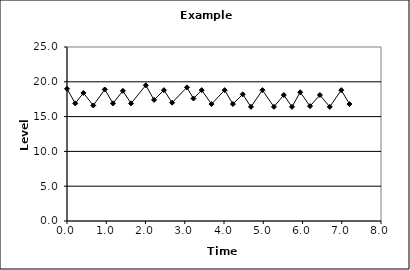
| Category | Series 0 |
|---|---|
| 0.0 | 19 |
| 0.20972222222189885 | 16.9 |
| 0.4187500000043656 | 18.4 |
| 0.6694444444437977 | 16.6 |
| 0.9625000000014552 | 18.9 |
| 1.171527777776646 | 16.9 |
| 1.4229166666700621 | 18.7 |
| 1.6319444444452529 | 16.9 |
| 2.008333333331393 | 19.5 |
| 2.218055555553292 | 17.4 |
| 2.46875 | 18.8 |
| 2.6777777777824667 | 17 |
| 3.054861111115315 | 19.2 |
| 3.2222222222262644 | 17.6 |
| 3.431250000001455 | 18.8 |
| 3.6819444444481633 | 16.8 |
| 4.016666666670062 | 18.8 |
| 4.226388888891961 | 16.8 |
| 4.477083333331393 | 18.2 |
| 4.686805555553292 | 16.4 |
| 4.979166666664241 | 18.8 |
| 5.272222222221899 | 16.4 |
| 5.522916666668607 | 18.1 |
| 5.731944444443798 | 16.4 |
| 5.9416666666656965 | 18.5 |
| 6.192361111112405 | 16.5 |
| 6.443749999998545 | 18.1 |
| 6.694444444445253 | 16.4 |
| 6.98750000000291 | 18.8 |
| 7.196527777778101 | 16.8 |